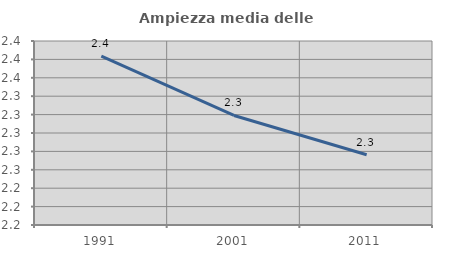
| Category | Ampiezza media delle famiglie |
|---|---|
| 1991.0 | 2.384 |
| 2001.0 | 2.319 |
| 2011.0 | 2.276 |